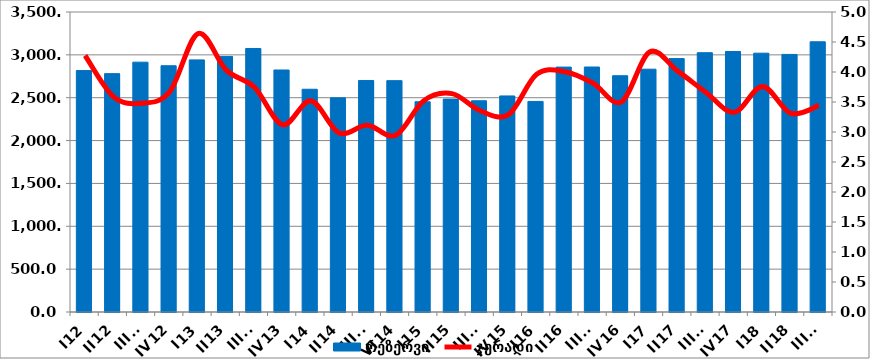
| Category | რეზერვი |
|---|---|
| I12 | 2816.705 |
| II12 | 2780.985 |
| III12 | 2914.659 |
| IV12 | 2872.974 |
| I13 | 2941.281 |
| II13 | 2981.697 |
| III13 | 3074.514 |
| IV13 | 2823.422 |
| I14 | 2598.611 |
| II14 | 2498.141 |
| III14 | 2701.162 |
| VI14 | 2699.188 |
| I15 | 2452.88 |
| II15 | 2483.75 |
| III15 | 2464.306 |
| IV15 | 2520.576 |
| I16 | 2456.679 |
| II16 | 2857.244 |
| III16 | 2858.236 |
| IV16 | 2756.452 |
| I17 | 2832.873 |
| II17 | 2956.464 |
| III17 | 3025.14 |
| IV17 | 3039.265 |
| I18 | 3019.7 |
| II18 | 3005.135 |
| III18 | 3152.59 |